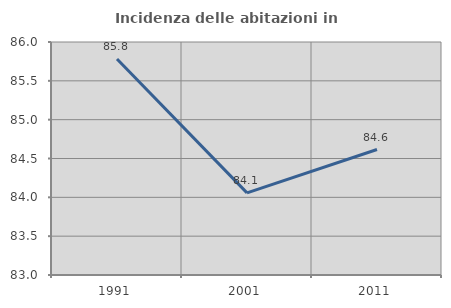
| Category | Incidenza delle abitazioni in proprietà  |
|---|---|
| 1991.0 | 85.782 |
| 2001.0 | 84.058 |
| 2011.0 | 84.615 |